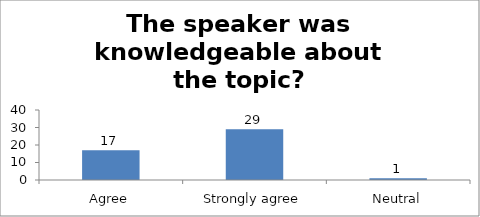
| Category | The speaker was knowledgeable about the topic? |
|---|---|
| Agree | 17 |
| Strongly agree | 29 |
| Neutral | 1 |